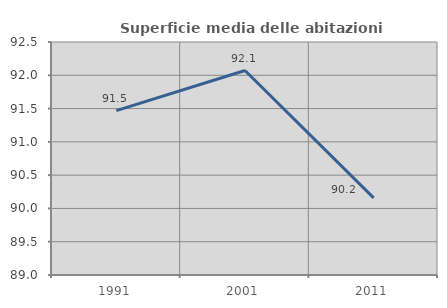
| Category | Superficie media delle abitazioni occupate |
|---|---|
| 1991.0 | 91.469 |
| 2001.0 | 92.072 |
| 2011.0 | 90.158 |